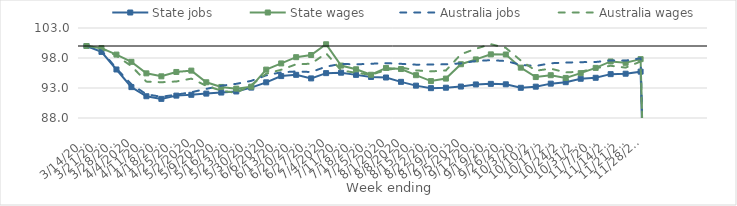
| Category | State jobs | State wages | Australia jobs | Australia wages |
|---|---|---|---|---|
| 14/03/2020 | 100 | 100 | 100 | 100 |
| 21/03/2020 | 99.017 | 99.641 | 99.244 | 99.654 |
| 28/03/2020 | 96.086 | 98.569 | 96.24 | 98.376 |
| 04/04/2020 | 93.146 | 97.361 | 93.611 | 96.647 |
| 11/04/2020 | 91.626 | 95.442 | 91.951 | 94.065 |
| 18/04/2020 | 91.188 | 94.946 | 91.54 | 93.96 |
| 25/04/2020 | 91.73 | 95.673 | 91.89 | 94.086 |
| 02/05/2020 | 91.867 | 95.896 | 92.294 | 94.563 |
| 09/05/2020 | 92.066 | 93.954 | 92.851 | 93.362 |
| 16/05/2020 | 92.242 | 93.177 | 93.38 | 92.559 |
| 23/05/2020 | 92.422 | 92.896 | 93.691 | 92.191 |
| 30/05/2020 | 93.066 | 93.22 | 94.189 | 93.489 |
| 06/06/2020 | 93.946 | 96.065 | 95.112 | 95.384 |
| 13/06/2020 | 94.985 | 97.094 | 95.61 | 96.041 |
| 20/06/2020 | 95.198 | 98.136 | 95.758 | 96.951 |
| 27/06/2020 | 94.601 | 98.499 | 95.662 | 97.048 |
| 04/07/2020 | 95.479 | 100.288 | 96.562 | 98.782 |
| 11/07/2020 | 95.552 | 96.739 | 97.02 | 95.951 |
| 18/07/2020 | 95.188 | 96.12 | 96.939 | 95.522 |
| 25/07/2020 | 94.839 | 95.208 | 97.042 | 95.21 |
| 01/08/2020 | 94.749 | 96.343 | 97.145 | 95.98 |
| 08/08/2020 | 94.025 | 96.159 | 97.028 | 96.418 |
| 15/08/2020 | 93.394 | 95.137 | 96.891 | 95.936 |
| 22/08/2020 | 92.973 | 94.153 | 96.912 | 95.768 |
| 29/08/2020 | 93.048 | 94.569 | 96.951 | 95.924 |
| 05/09/2020 | 93.244 | 96.96 | 97.102 | 98.618 |
| 12/09/2020 | 93.592 | 97.765 | 97.5 | 99.542 |
| 19/09/2020 | 93.688 | 98.605 | 97.636 | 100.304 |
| 26/09/2020 | 93.617 | 98.585 | 97.498 | 99.685 |
| 03/10/2020 | 93.034 | 96.392 | 96.847 | 97.575 |
| 10/10/2020 | 93.223 | 94.823 | 96.677 | 95.876 |
| 17/10/2020 | 93.726 | 95.132 | 97.124 | 96.224 |
| 24/10/2020 | 93.97 | 94.677 | 97.241 | 95.599 |
| 31/10/2020 | 94.541 | 95.472 | 97.306 | 95.715 |
| 07/11/2020 | 94.703 | 96.354 | 97.335 | 96.299 |
| 14/11/2020 | 95.308 | 97.424 | 97.6 | 96.705 |
| 21/11/2020 | 95.381 | 97.197 | 97.567 | 96.396 |
| 28/11/2020 | 95.727 | 97.809 | 97.955 | 97.416 |